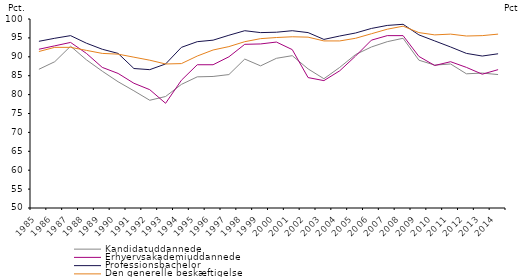
| Category | Kandidatuddannede | Erhvervsakademiuddannede | Professionsbachelor | Den generelle beskæftigelse |
|---|---|---|---|---|
| 1985.0 | 86.7 | 92 | 94.1 | 91.4 |
| 1986.0 | 88.7 | 92.9 | 94.9 | 92.5 |
| 1987.0 | 92.8 | 93.8 | 95.6 | 92.5 |
| 1988.0 | 89.2 | 90.9 | 93.6 | 91.7 |
| 1989.0 | 86.2 | 87.2 | 92 | 90.9 |
| 1990.0 | 83.4 | 85.6 | 90.9 | 90.7 |
| 1991.0 | 81 | 83 | 86.9 | 89.9 |
| 1992.0 | 78.5 | 81.3 | 86.6 | 89.1 |
| 1993.0 | 79.5 | 77.7 | 88.1 | 88.1 |
| 1994.0 | 82.7 | 83.8 | 92.5 | 88.2 |
| 1995.0 | 84.7 | 87.9 | 94 | 90.2 |
| 1996.0 | 84.8 | 87.9 | 94.4 | 91.8 |
| 1997.0 | 85.3 | 90 | 95.7 | 92.7 |
| 1998.0 | 89.4 | 93.3 | 96.9 | 94 |
| 1999.0 | 87.6 | 93.4 | 96.4 | 94.8 |
| 2000.0 | 89.6 | 93.9 | 96.5 | 95.1 |
| 2001.0 | 90.3 | 91.9 | 96.9 | 95.3 |
| 2002.0 | 86.8 | 84.5 | 96.4 | 95.2 |
| 2003.0 | 84.2 | 83.7 | 94.6 | 94.2 |
| 2004.0 | 87.2 | 86.3 | 95.5 | 94.2 |
| 2005.0 | 90.6 | 90.2 | 96.3 | 94.9 |
| 2006.0 | 92.6 | 94.4 | 97.5 | 96.1 |
| 2007.0 | 94 | 95.6 | 98.3 | 97.3 |
| 2008.0 | 94.9 | 95.6 | 98.6 | 98.1 |
| 2009.0 | 89.1 | 90.1 | 95.8 | 96.4 |
| 2010.0 | 87.8 | 87.7 | 94.2 | 95.8 |
| 2011.0 | 88.1 | 88.7 | 92.6 | 96 |
| 2012.0 | 85.5 | 87.2 | 90.9 | 95.5 |
| 2013.0 | 85.7 | 85.4 | 90.2 | 95.6 |
| 2014.0 | 85.3 | 86.6 | 90.8 | 96 |